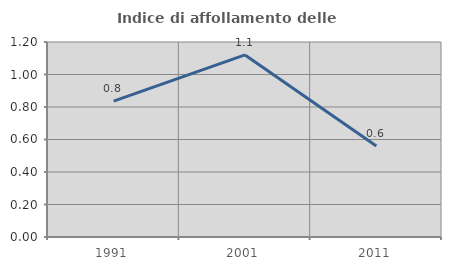
| Category | Indice di affollamento delle abitazioni  |
|---|---|
| 1991.0 | 0.836 |
| 2001.0 | 1.12 |
| 2011.0 | 0.56 |